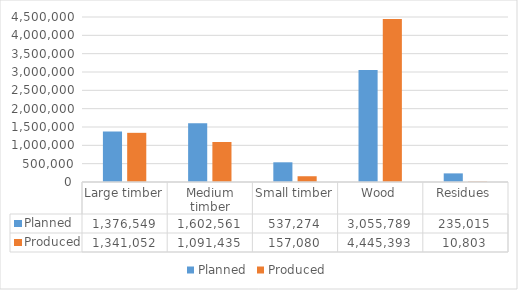
| Category | Planned | Produced |
|---|---|---|
| Large timber | 1376549 | 1341052 |
| Medium timber | 1602561 | 1091435 |
| Small timber | 537274 | 157080 |
| Wood | 3055789 | 4445393 |
| Residues | 235015 | 10803 |